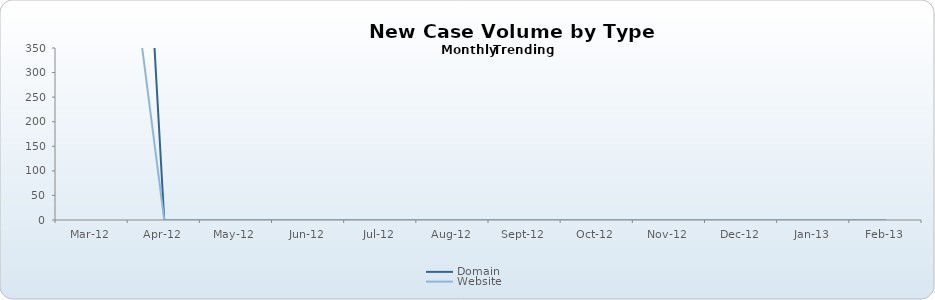
| Category | Domain | Website |
|---|---|---|
| 2012-03-15 | 2597 | 1146 |
| 2012-04-15 | 0 | 0 |
| 2012-05-15 | 0 | 0 |
| 2012-06-15 | 0 | 0 |
| 2012-07-15 | 0 | 0 |
| 2012-08-15 | 0 | 0 |
| 2012-09-15 | 0 | 0 |
| 2012-10-15 | 0 | 0 |
| 2012-11-15 | 0 | 0 |
| 2012-12-15 | 0 | 0 |
| 2013-01-15 | 0 | 0 |
| 2013-02-15 | 0 | 0 |